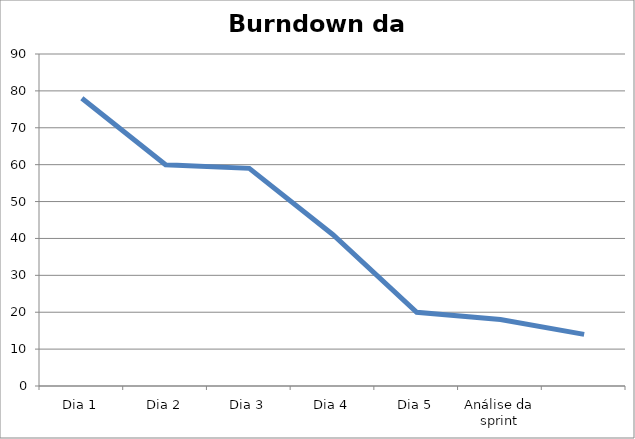
| Category | Gráfico de burndown da sprint |
|---|---|
| Dia 1 | 78 |
| Dia 2 | 60 |
| Dia 3 | 59 |
| Dia 4 | 41 |
| Dia 5 | 20 |
| Análise da sprint | 18 |